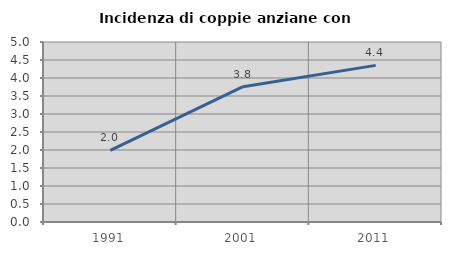
| Category | Incidenza di coppie anziane con figli |
|---|---|
| 1991.0 | 1.991 |
| 2001.0 | 3.758 |
| 2011.0 | 4.351 |